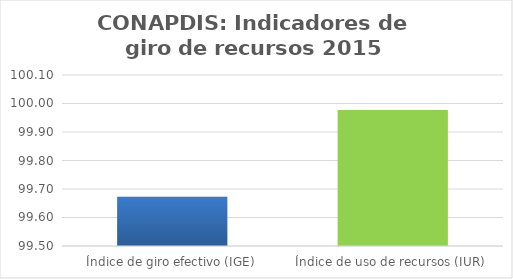
| Category | Series 0 |
|---|---|
| Índice de giro efectivo (IGE) | 99.673 |
| Índice de uso de recursos (IUR)  | 99.977 |